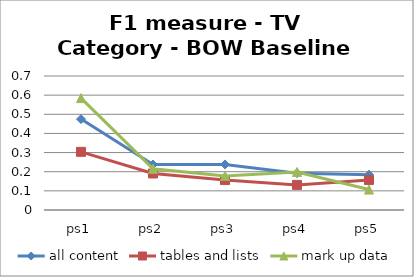
| Category | all content | tables and lists | mark up data |
|---|---|---|---|
| ps1 | 0.475 | 0.304 | 0.585 |
| ps2 | 0.238 | 0.191 | 0.215 |
| ps3 | 0.238 | 0.156 | 0.178 |
| ps4 | 0.193 | 0.131 | 0.199 |
| ps5 | 0.185 | 0.157 | 0.107 |